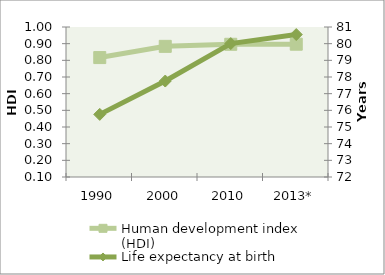
| Category | Human development index (HDI) |
|---|---|
| 1990 | 0.817 |
| 2000 | 0.884 |
| 2010 | 0.896 |
| 2013* | 0.897 |